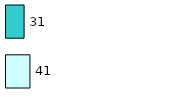
| Category | Series 0 | Series 1 |
|---|---|---|
| 0 | 41 | 31 |